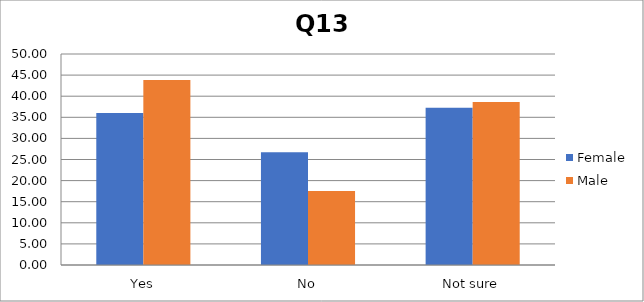
| Category | Female | Male |
|---|---|---|
| Yes | 36.025 | 43.86 |
| No | 26.708 | 17.544 |
| Not sure | 37.267 | 38.596 |